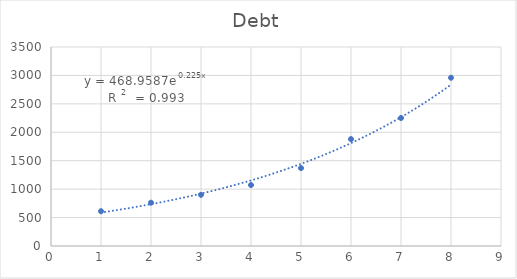
| Category | Debt |
|---|---|
| 1.0 | 612.05 |
| 2.0 | 761.88 |
| 3.0 | 899.8 |
| 4.0 | 1071.93 |
| 5.0 | 1370.63 |
| 6.0 | 1880.04 |
| 7.0 | 2251.31 |
| 8.0 | 2958.92 |